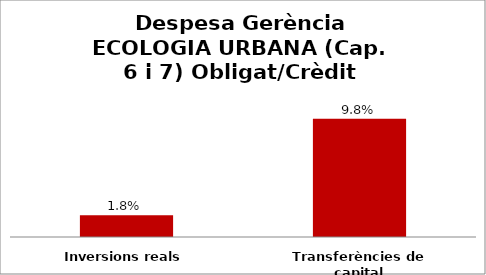
| Category | Series 0 |
|---|---|
| Inversions reals | 0.018 |
| Transferències de capital | 0.098 |